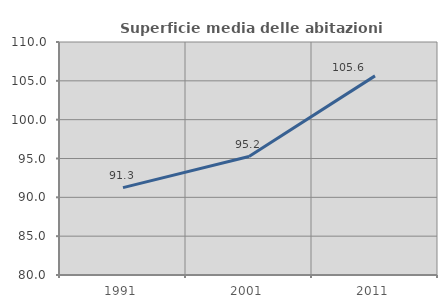
| Category | Superficie media delle abitazioni occupate |
|---|---|
| 1991.0 | 91.253 |
| 2001.0 | 95.248 |
| 2011.0 | 105.64 |